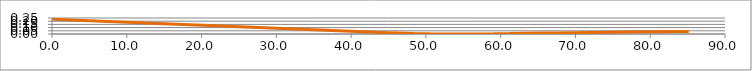
| Category | Series 0 |
|---|---|
| 0.0 | 0.23 |
| 43.254 | 0.026 |
| 45.9668 | 0.015 |
| 48.3555 | 0.007 |
| 50.5711 | 0.002 |
| 52.7102 | 0 |
| 54.8257 | 0 |
| 56.9426 | 0.002 |
| 59.07 | 0.004 |
| 61.2095 | 0.007 |
| 63.3598 | 0.011 |
| 65.5186 | 0.014 |
| 67.684 | 0.018 |
| 69.8543 | 0.021 |
| 72.0289 | 0.024 |
| 74.2071 | 0.027 |
| 76.3888 | 0.03 |
| 78.5741 | 0.033 |
| 80.7633 | 0.036 |
| 82.9567 | 0.039 |
| 85.1546 | 0.041 |